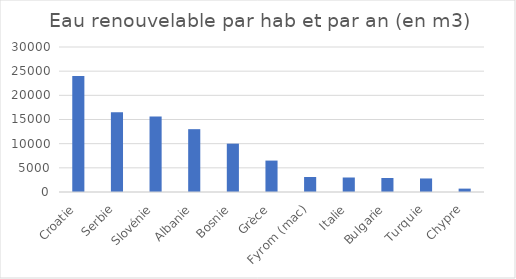
| Category | Series 0 |
|---|---|
| Croatie | 24000 |
| Serbie | 16500 |
| Slovénie | 15600 |
| Albanie | 13000 |
| Bosnie | 10000 |
| Grèce | 6500 |
| Fyrom (mac) | 3100 |
| Italie | 3000 |
| Bulgarie | 2900 |
| Turquie | 2800 |
| Chypre | 700 |